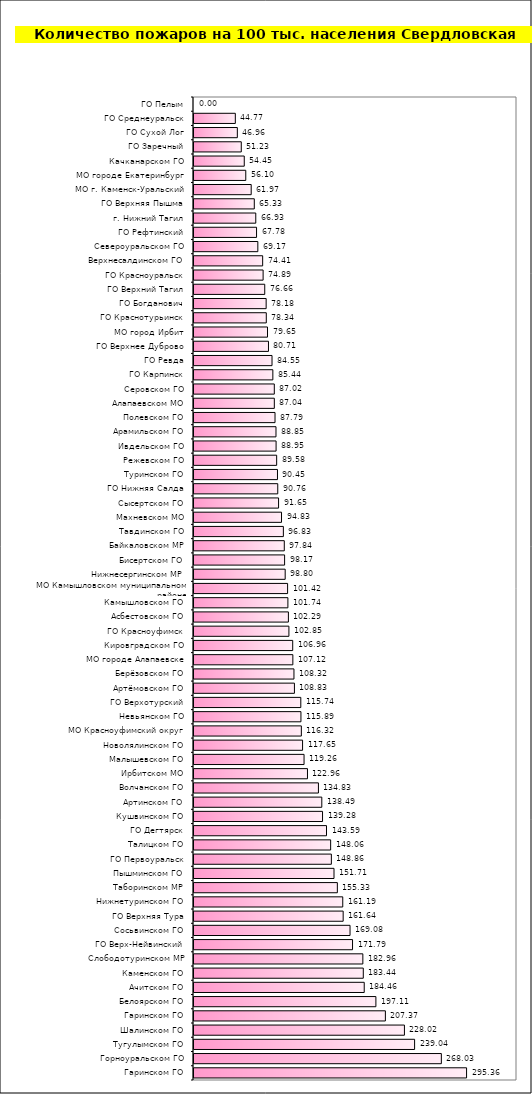
| Category | Series 0 |
|---|---|
| Гаринском ГО | 295.359 |
| Горноуральском ГО | 268.035 |
| Тугулымском ГО | 239.04 |
| Шалинском ГО | 228.023 |
| Гаринском ГО | 207.373 |
| Белоярском ГО | 197.107 |
| Ачитском ГО | 184.456 |
| Каменском ГО | 183.436 |
| Слободотуринском МР | 182.963 |
| ГО Верх-Нейвинский | 171.789 |
| Сосьвинском ГО | 169.079 |
| ГО Верхняя Тура | 161.638 |
| Нижнетуринском ГО | 161.188 |
| Таборинском МР | 155.328 |
| Пышминском ГО | 151.707 |
| ГО Первоуральск | 148.855 |
| Талицком ГО | 148.063 |
| ГО Дегтярск | 143.588 |
| Кушвинском ГО | 139.283 |
| Артинском ГО | 138.494 |
| Волчанском ГО | 134.827 |
| Ирбитском МО | 122.959 |
| Малышевском ГО | 119.255 |
| Новолялинском ГО | 117.647 |
| МО Красноуфимский округ | 116.318 |
| Невьянском ГО | 115.891 |
| ГО Верхотурский | 115.741 |
| Артёмовском ГО | 108.831 |
| Берёзовском ГО | 108.316 |
| МО городе Алапаевске | 107.118 |
| Кировградском ГО | 106.964 |
| ГО Красноуфимск | 102.85 |
| Асбестовском ГО | 102.285 |
| Камышловском ГО | 101.745 |
| МО Камышловском муниципальном районе | 101.42 |
| Нижнесергинском МР | 98.8 |
| Бисертском ГО | 98.174 |
| Байкаловском МР | 97.841 |
| Тавдинском ГО | 96.834 |
| Махневском МО | 94.832 |
| Сысертском ГО | 91.647 |
| ГО Нижняя Салда | 90.76 |
| Туринском ГО | 90.447 |
| Режевском ГО | 89.578 |
| Ивдельском ГО | 88.952 |
| Арамильском ГО | 88.849 |
| Полевском ГО | 87.79 |
| Алапаевском МО | 87.039 |
| Серовском ГО | 87.022 |
| ГО Карпинск | 85.442 |
| ГО Ревда | 84.553 |
| ГО Верхнее Дуброво | 80.71 |
| МО город Ирбит | 79.65 |
| ГО Краснотурьинск | 78.338 |
| ГО Богданович | 78.183 |
| ГО Верхний Тагил | 76.664 |
| ГО Красноуральск | 74.891 |
| Верхнесалдинском ГО | 74.41 |
| Североуральском ГО | 69.166 |
| ГО Рефтинский | 67.78 |
| г. Нижний Тагил | 66.932 |
| ГО Верхняя Пышма | 65.327 |
| МО г. Каменск-Уральский | 61.971 |
| МО городе Екатеринбург | 56.105 |
| Качканарском ГО | 54.451 |
| ГО Заречный | 51.231 |
| ГО Сухой Лог | 46.965 |
| ГО Среднеуральск | 44.775 |
| ГО Пелым | 0 |